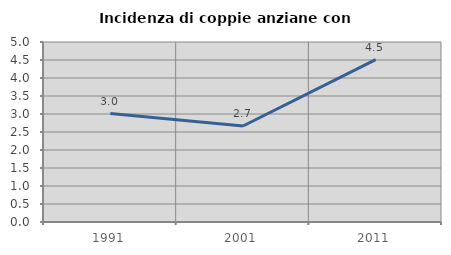
| Category | Incidenza di coppie anziane con figli |
|---|---|
| 1991.0 | 3.012 |
| 2001.0 | 2.666 |
| 2011.0 | 4.509 |